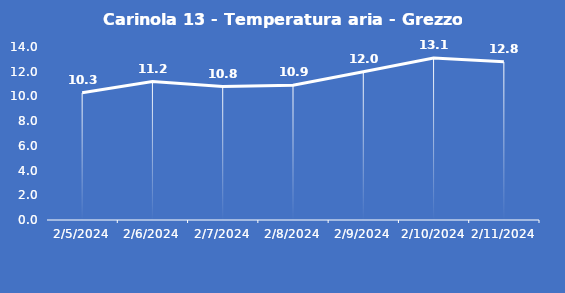
| Category | Carinola 13 - Temperatura aria - Grezzo (°C) |
|---|---|
| 2/5/24 | 10.3 |
| 2/6/24 | 11.2 |
| 2/7/24 | 10.8 |
| 2/8/24 | 10.9 |
| 2/9/24 | 12 |
| 2/10/24 | 13.1 |
| 2/11/24 | 12.8 |